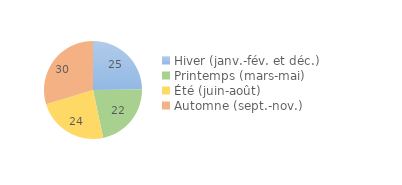
| Category | Series 0 |
|---|---|
| Hiver (janv.-fév. et déc.) | 24.85 |
| Printemps (mars-mai) | 21.82 |
| Été (juin-août) | 23.64 |
| Automne (sept.-nov.) | 29.7 |